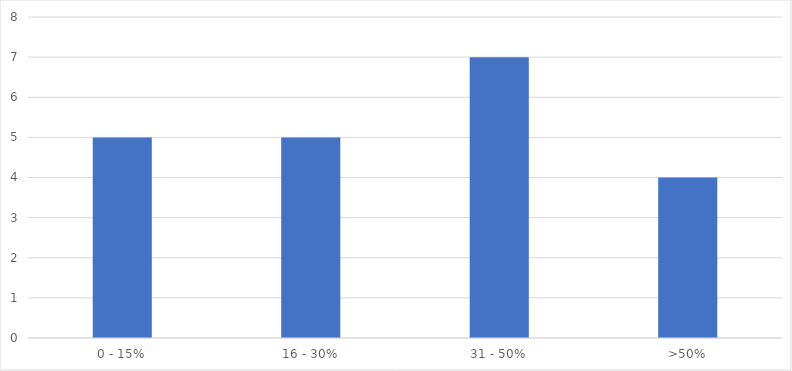
| Category | Number of Responses |
|---|---|
| 0 - 15% | 5 |
| 16 - 30% | 5 |
| 31 - 50% | 7 |
| >50% | 4 |